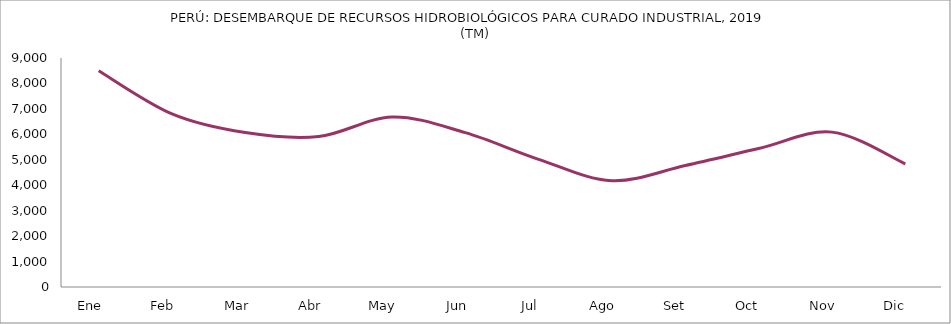
| Category | Series 0 |
|---|---|
| Ene    | 8496.717 |
| Feb    | 6800.685 |
| Mar    | 6067.873 |
| Abr    | 5912.532 |
| May    | 6679.229 |
| Jun    | 6067.059 |
| Jul    | 5018.138 |
| Ago    | 4177.279 |
| Set     | 4776.427 |
| Oct     | 5440.924 |
| Nov    | 6086.874 |
| Dic     | 4841.42 |